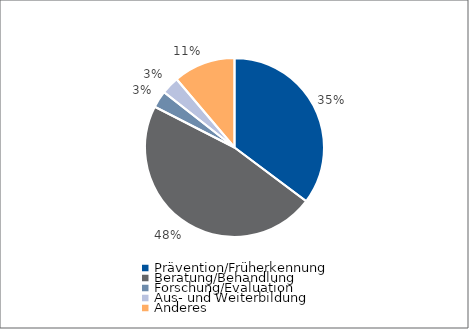
| Category | Series 0 |
|---|---|
| Prävention/Früherkennung | 38222.29 |
| Beratung/Behandlung | 51309.36 |
| Forschung/Evaluation | 3334.01 |
| Aus- und Weiterbildung | 3486.17 |
| Anderes | 12143.7 |